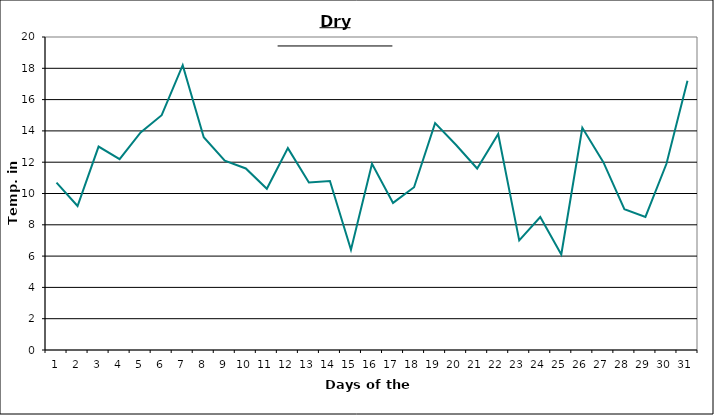
| Category | Series 0 |
|---|---|
| 0 | 10.7 |
| 1 | 9.2 |
| 2 | 13 |
| 3 | 12.2 |
| 4 | 13.9 |
| 5 | 15 |
| 6 | 18.2 |
| 7 | 13.6 |
| 8 | 12.1 |
| 9 | 11.6 |
| 10 | 10.3 |
| 11 | 12.9 |
| 12 | 10.7 |
| 13 | 10.8 |
| 14 | 6.4 |
| 15 | 11.9 |
| 16 | 9.4 |
| 17 | 10.4 |
| 18 | 14.5 |
| 19 | 13.1 |
| 20 | 11.6 |
| 21 | 13.8 |
| 22 | 7 |
| 23 | 8.5 |
| 24 | 6.1 |
| 25 | 14.2 |
| 26 | 12 |
| 27 | 9 |
| 28 | 8.5 |
| 29 | 11.9 |
| 30 | 17.2 |